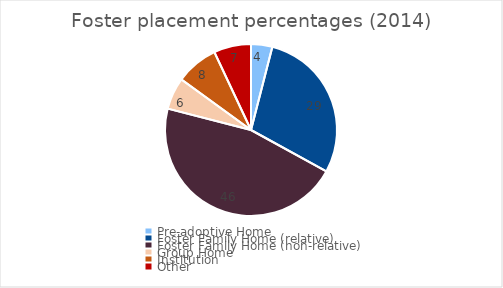
| Category | Series 0 |
|---|---|
| Pre-adoptive Home | 4 |
| Foster Family Home (relative) | 29 |
| Foster Family Home (non-relative) | 46 |
| Group Home | 6 |
| Institution | 8 |
| Other | 7 |